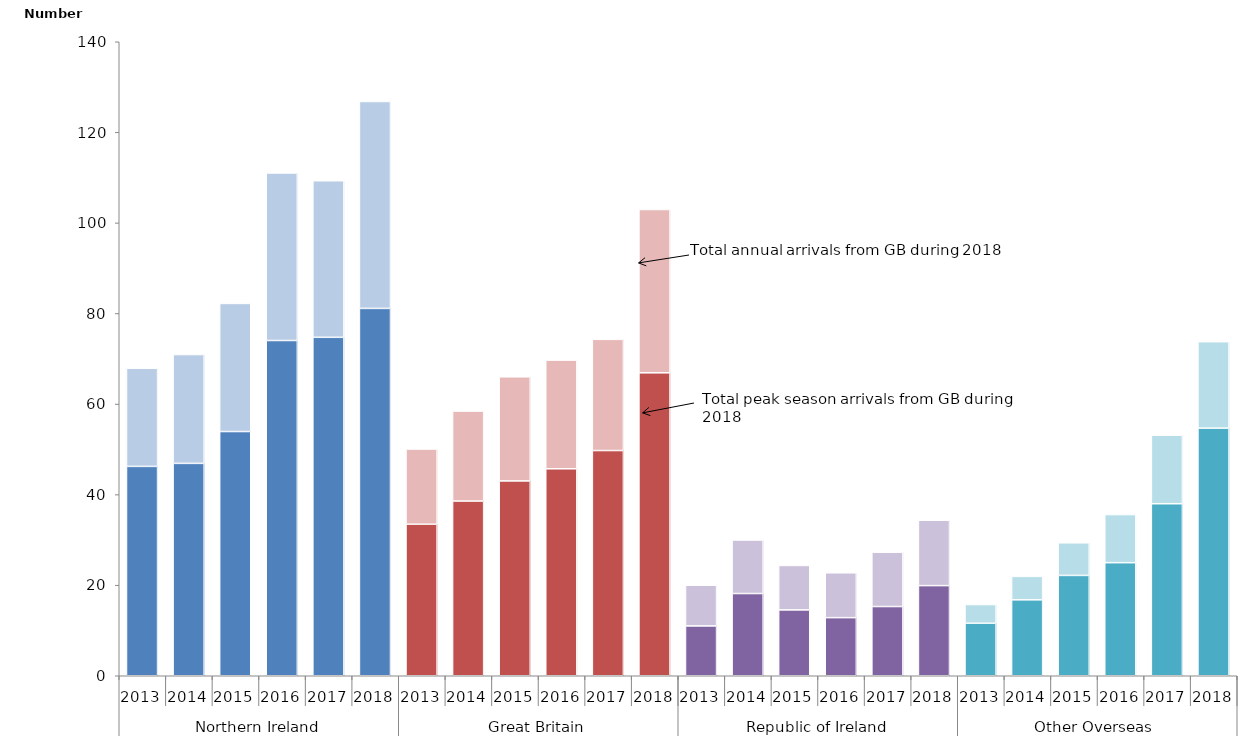
| Category | peak | off-peak |
|---|---|---|
| 0 | 46232.716 | 21661.029 |
| 1 | 46899.135 | 24030.645 |
| 2 | 53931.05 | 28280.24 |
| 3 | 74027.73 | 36986.39 |
| 4 | 74734.56 | 34573.34 |
| 5 | 81119.79 | 45689.65 |
| 6 | 33459.617 | 16600.984 |
| 7 | 38581.683 | 19866.81 |
| 8 | 43028.66 | 22983.18 |
| 9 | 45702.49 | 24000.55 |
| 10 | 49729.79 | 24555.47 |
| 11 | 66898.09 | 36058.13 |
| 12 | 11008.547 | 8977.777 |
| 13 | 18157.992 | 11810.287 |
| 14 | 14543.4 | 9812.43 |
| 15 | 12832.02 | 9907.5 |
| 16 | 15286.17 | 11997.16 |
| 17 | 19907.88 | 14428.9 |
| 18 | 11592.669 | 4132.279 |
| 19 | 16767.14 | 5181.867 |
| 20 | 22155.12 | 7202.46 |
| 21 | 24969.49 | 10623.2 |
| 22 | 37985.58 | 15143.45 |
| 23 | 54683.24 | 19090.3 |